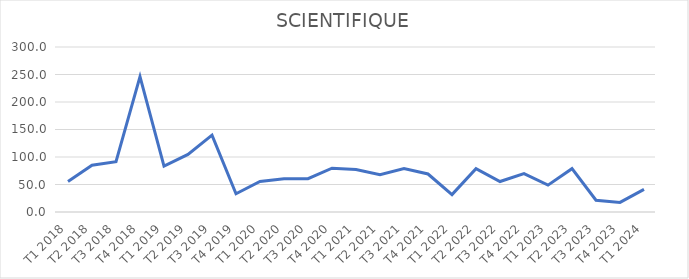
| Category | Series 0 |
|---|---|
| T1 2018 | 55.595 |
| T2 2018 | 85.09 |
| T3 2018 | 91.342 |
| T4 2018 | 246.251 |
| T1 2019 | 83.533 |
| T2 2019 | 104.678 |
| T3 2019 | 139.772 |
| T4 2019 | 33.164 |
| T1 2020 | 55.399 |
| T2 2020 | 60.543 |
| T3 2020 | 60.543 |
| T4 2020 | 79.684 |
| T1 2021 | 77.384 |
| T2 2021 | 67.716 |
| T3 2021 | 79.208 |
| T4 2021 | 69.104 |
| T1 2022 | 31.597 |
| T2 2022 | 78.815 |
| T3 2022 | 55.429 |
| T4 2022 | 69.774 |
| T1 2023 | 48.877 |
| T2 2023 | 78.815 |
| T3 2023 | 21.405 |
| T4 2023 | 17.439 |
| T1 2024 | 41.182 |